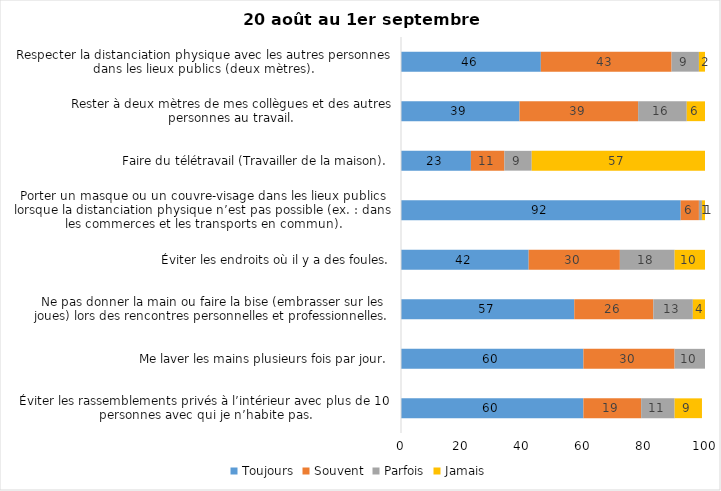
| Category | Toujours | Souvent | Parfois | Jamais |
|---|---|---|---|---|
| Éviter les rassemblements privés à l’intérieur avec plus de 10 personnes avec qui je n’habite pas. | 60 | 19 | 11 | 9 |
| Me laver les mains plusieurs fois par jour. | 60 | 30 | 10 | 0 |
| Ne pas donner la main ou faire la bise (embrasser sur les joues) lors des rencontres personnelles et professionnelles. | 57 | 26 | 13 | 4 |
| Éviter les endroits où il y a des foules. | 42 | 30 | 18 | 10 |
| Porter un masque ou un couvre-visage dans les lieux publics lorsque la distanciation physique n’est pas possible (ex. : dans les commerces et les transports en commun). | 92 | 6 | 1 | 1 |
| Faire du télétravail (Travailler de la maison). | 23 | 11 | 9 | 57 |
| Rester à deux mètres de mes collègues et des autres personnes au travail. | 39 | 39 | 16 | 6 |
| Respecter la distanciation physique avec les autres personnes dans les lieux publics (deux mètres). | 46 | 43 | 9 | 2 |